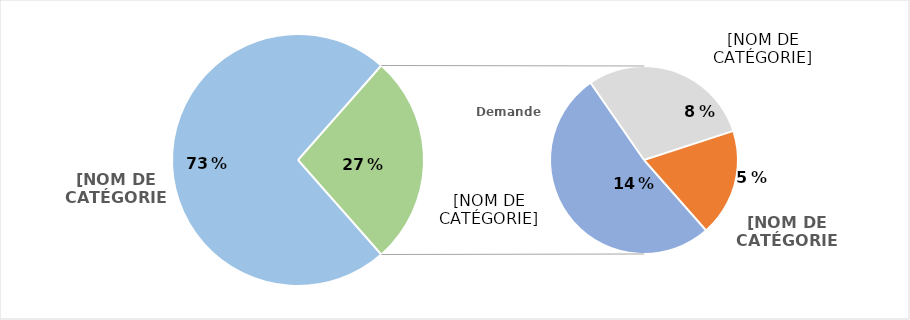
| Category | Series 0 |
|---|---|
| Aucune demande d'indemnisation | 0.73 |
| Banque | 0.14 |
| Assurance | 0.08 |
| Intermédiaire de paiement | 0 |
| Autres organismes | 0.05 |